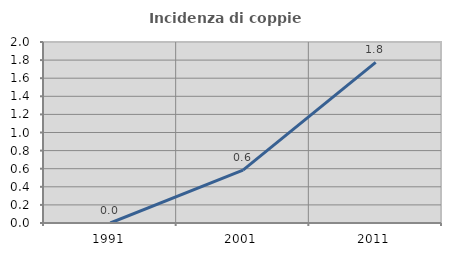
| Category | Incidenza di coppie miste |
|---|---|
| 1991.0 | 0 |
| 2001.0 | 0.585 |
| 2011.0 | 1.774 |